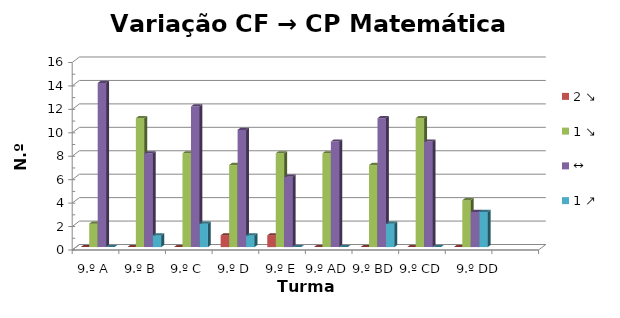
| Category | 2 ↘ | 1 ↘ | ↔ | 1 ↗ |
|---|---|---|---|---|
| 9.º A | 0 | 2 | 14 | 0 |
| 9.º B | 0 | 11 | 8 | 1 |
| 9.º C | 0 | 8 | 12 | 2 |
| 9.º D | 1 | 7 | 10 | 1 |
| 9.º E | 1 | 8 | 6 | 0 |
| 9.º AD | 0 | 8 | 9 | 0 |
| 9.º BD | 0 | 7 | 11 | 2 |
| 9.º CD | 0 | 11 | 9 | 0 |
| 9.º DD | 0 | 4 | 3 | 3 |